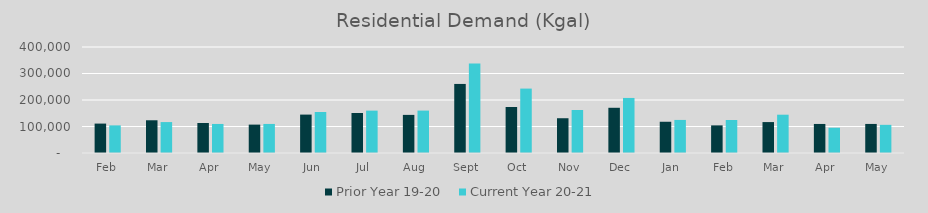
| Category | Prior Year 19-20  | Current Year 20-21 |
|---|---|---|
| Feb | 111009.962 | 104204.224 |
| Mar | 123525.131 | 116687.491 |
| Apr | 113258.787 | 109598.965 |
| May | 107128.051 | 109656.015 |
| Jun | 144930.453 | 154696.236 |
| Jul | 151028.014 | 159889.353 |
| Aug | 143816.337 | 160013.985 |
| Sep | 260607.456 | 337995.641 |
| Oct | 173601.368 | 243049.084 |
| Nov | 131198.833 | 162175.563 |
| Dec | 170629.384 | 207737.904 |
| Jan | 117899.625 | 124779.797 |
| Feb | 104204.224 | 124538.238 |
| Mar | 116687.491 | 144510.137 |
| Apr | 109598.965 | 95313.825 |
| May | 109656.015 | 106271.913 |